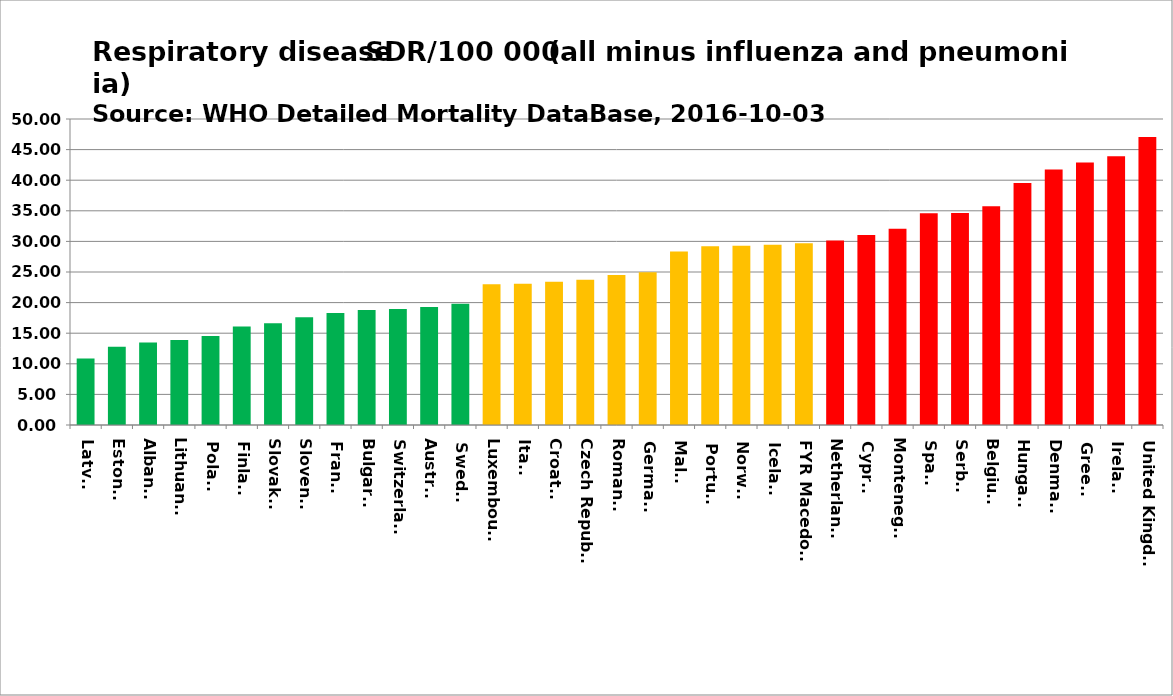
| Category | Series 0 |
|---|---|
| Latvia | 10.85 |
| Estonia | 12.778 |
| Albania | 13.474 |
| Lithuania | 13.886 |
| Poland | 14.538 |
| Finland | 16.075 |
| Slovakia | 16.635 |
| Slovenia | 17.599 |
| France | 18.283 |
| Bulgaria | 18.794 |
| Switzerland | 18.961 |
| Austria | 19.268 |
| Sweden | 19.817 |
| Luxembourg | 23.003 |
| Italy | 23.073 |
| Croatia | 23.399 |
| Czech Republic | 23.721 |
| Romania | 24.5 |
| Germany | 24.97 |
| Malta | 28.33 |
| Portugal | 29.223 |
| Norway | 29.289 |
| Iceland | 29.455 |
| FYR Macedonia | 29.697 |
| Netherlands | 30.135 |
| Cyprus | 31.045 |
| Montenegro | 32.083 |
| Spain | 34.595 |
| Serbia | 34.639 |
| Belgium | 35.733 |
| Hungary | 39.525 |
| Denmark | 41.765 |
| Greece | 42.909 |
| Ireland | 43.899 |
| United Kingdom | 47.071 |